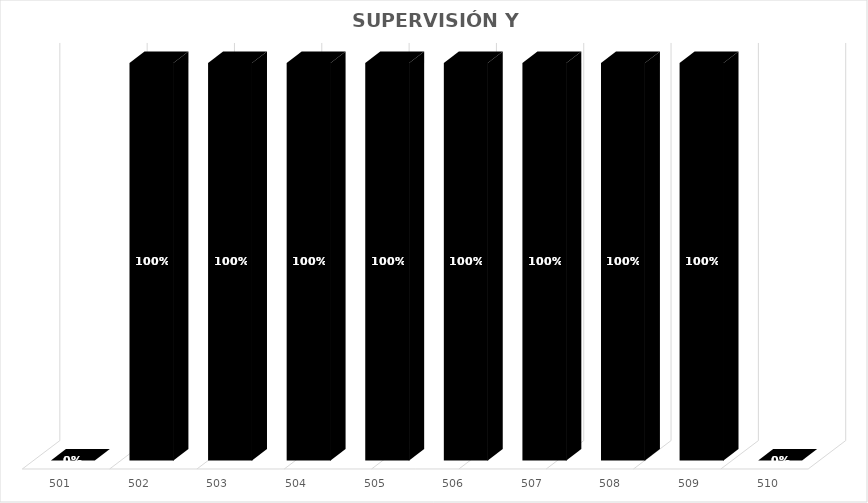
| Category | % Avance |
|---|---|
| 501.0 | 0 |
| 502.0 | 1 |
| 503.0 | 1 |
| 504.0 | 1 |
| 505.0 | 1 |
| 506.0 | 1 |
| 507.0 | 1 |
| 508.0 | 1 |
| 509.0 | 1 |
| 510.0 | 0 |